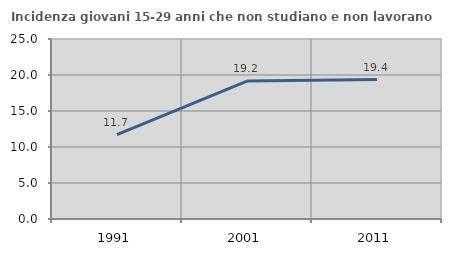
| Category | Incidenza giovani 15-29 anni che non studiano e non lavorano  |
|---|---|
| 1991.0 | 11.719 |
| 2001.0 | 19.155 |
| 2011.0 | 19.361 |